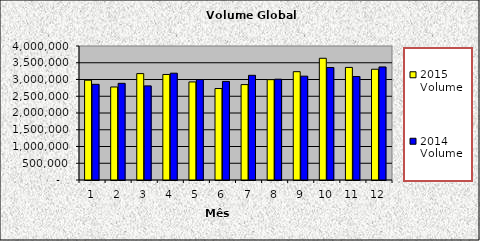
| Category | 2015 Volume | 2014 Volume |
|---|---|---|
| 0 | 2980332.333 | 2856112.833 |
| 1 | 2776889.667 | 2885470.333 |
| 2 | 3176070.167 | 2809021.333 |
| 3 | 3149914.833 | 3188371.5 |
| 4 | 2926983 | 2998911.833 |
| 5 | 2730748.167 | 2942450.5 |
| 6 | 2847872 | 3124964.333 |
| 7 | 2995693.761 | 3009193.667 |
| 8 | 3233337.06 | 3099583.38 |
| 9 | 3633840.33 | 3357912 |
| 10 | 3360240 | 3088319.667 |
| 11 | 3306431 | 3374846.333 |